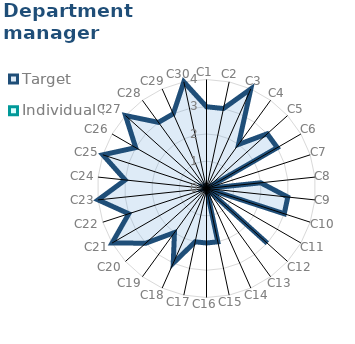
| Category | Target | Individual 5 |
|---|---|---|
| C1 | 3 | 0 |
| C2 | 3 | 0 |
| C3 | 4 | 0 |
| C4 | 2 | 0 |
| C5 | 3 | 0 |
| C6 | 3 | 0 |
| C7 | 0 | 0 |
| C8 | 2 | 0 |
| C9 | 3 | 0 |
| C10 | 3 | 0 |
| C11 | 0 | 0 |
| C12 | 3 | 0 |
| C13 | 0 | 0 |
| C14 | 0 | 0 |
| C15 | 2 | 0 |
| C16 | 2 | 0 |
| C17 | 2 | 0 |
| C18 | 3 | 0 |
| C19 | 2 | 0 |
| C20 | 3 | 0 |
| C21 | 4 | 0 |
| C22 | 3 | 0 |
| C23 | 4 | 0 |
| C24 | 3 | 0 |
| C25 | 4 | 0 |
| C26 | 3 | 0 |
| C27 | 4 | 0 |
| C28 | 3 | 0 |
| C29 | 3 | 0 |
| C30 | 4 | 0 |